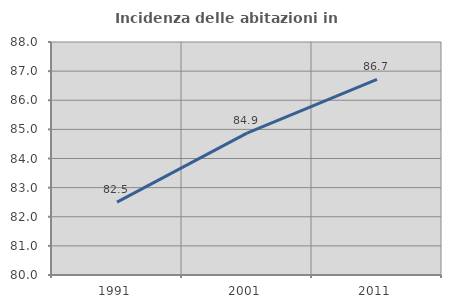
| Category | Incidenza delle abitazioni in proprietà  |
|---|---|
| 1991.0 | 82.505 |
| 2001.0 | 84.873 |
| 2011.0 | 86.714 |